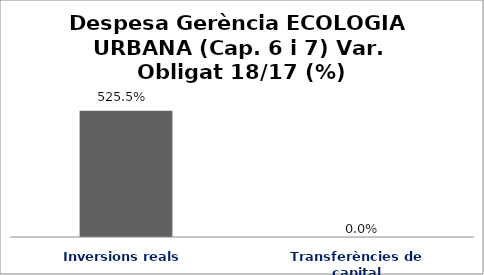
| Category | Series 0 |
|---|---|
| Inversions reals | 5.255 |
| Transferències de capital | 0 |